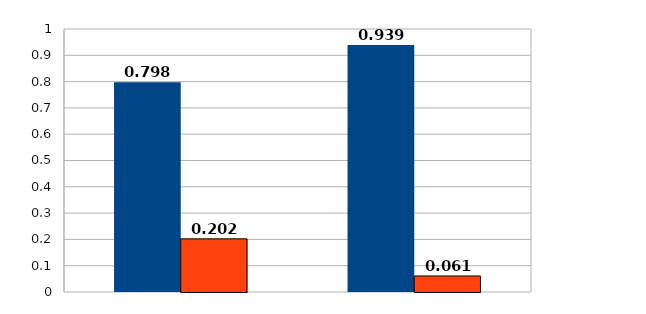
| Category | Series 0 | Series 1 |
|---|---|---|
| 0 | 0.798 | 0.202 |
| 1 | 0.939 | 0.061 |